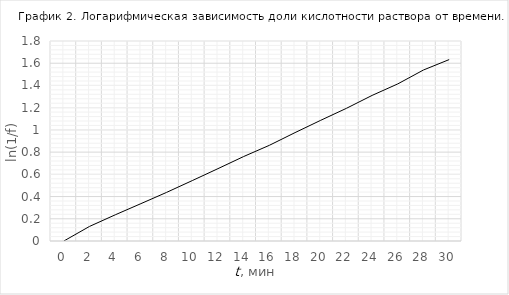
| Category | ln(1/f) |
|---|---|
| 0.0 | 0 |
| 2.0 | 0.131 |
| 4.0 | 0.236 |
| 6.0 | 0.336 |
| 8.0 | 0.438 |
| 10.0 | 0.544 |
| 12.0 | 0.651 |
| 14.0 | 0.76 |
| 16.0 | 0.861 |
| 18.0 | 0.975 |
| 20.0 | 1.086 |
| 22.0 | 1.194 |
| 24.0 | 1.31 |
| 26.0 | 1.414 |
| 28.0 | 1.539 |
| 30.0 | 1.633 |